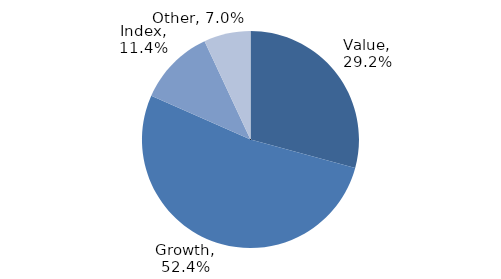
| Category | Investment Style |
|---|---|
| Value | 0.292 |
| Growth | 0.524 |
| Index | 0.114 |
| Other | 0.07 |